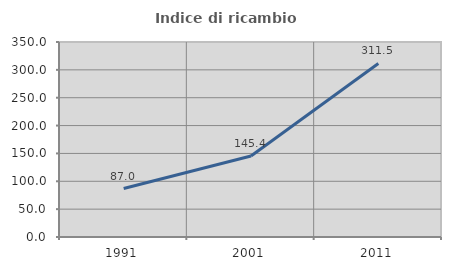
| Category | Indice di ricambio occupazionale  |
|---|---|
| 1991.0 | 86.971 |
| 2001.0 | 145.395 |
| 2011.0 | 311.511 |